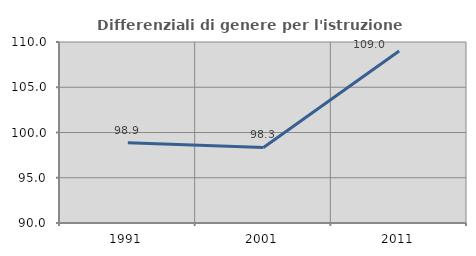
| Category | Differenziali di genere per l'istruzione superiore |
|---|---|
| 1991.0 | 98.861 |
| 2001.0 | 98.343 |
| 2011.0 | 109.005 |